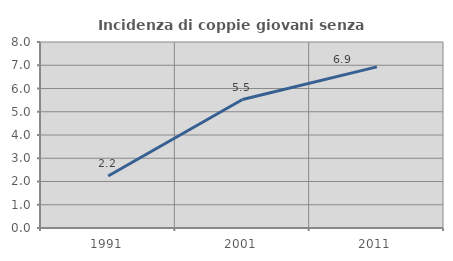
| Category | Incidenza di coppie giovani senza figli |
|---|---|
| 1991.0 | 2.235 |
| 2001.0 | 5.525 |
| 2011.0 | 6.931 |